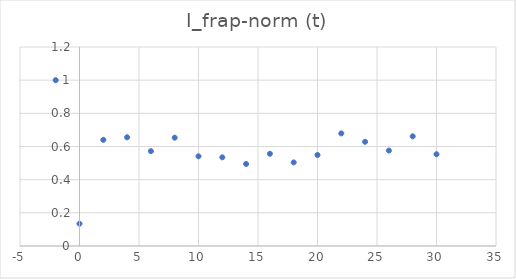
| Category | I_frap-norm (t) |
|---|---|
| -2.0 | 1 |
| 0.0 | 0.134 |
| 2.0 | 0.64 |
| 4.0 | 0.656 |
| 6.0 | 0.572 |
| 8.0 | 0.653 |
| 10.0 | 0.541 |
| 12.0 | 0.535 |
| 14.0 | 0.495 |
| 16.0 | 0.556 |
| 18.0 | 0.504 |
| 20.0 | 0.549 |
| 22.0 | 0.679 |
| 24.0 | 0.628 |
| 26.0 | 0.576 |
| 28.0 | 0.661 |
| 30.0 | 0.553 |